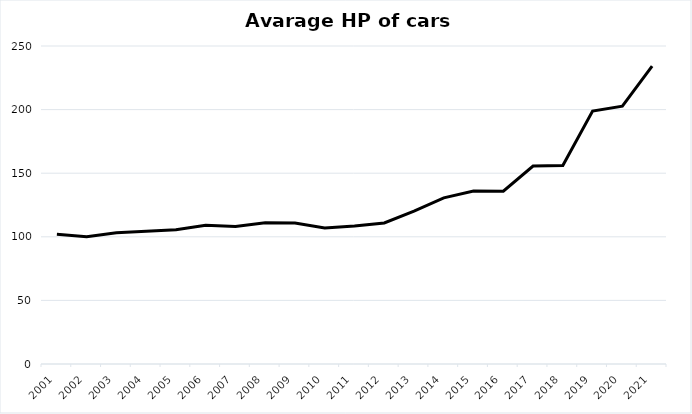
| Category | Series 0 |
|---|---|
| 2001.0 | 101.98 |
| 2002.0 | 100.057 |
| 2003.0 | 103.187 |
| 2004.0 | 104.455 |
| 2005.0 | 105.495 |
| 2006.0 | 109.148 |
| 2007.0 | 108.168 |
| 2008.0 | 111.052 |
| 2009.0 | 110.879 |
| 2010.0 | 106.878 |
| 2011.0 | 108.566 |
| 2012.0 | 110.914 |
| 2013.0 | 120.16 |
| 2014.0 | 130.621 |
| 2015.0 | 135.972 |
| 2016.0 | 135.851 |
| 2017.0 | 155.581 |
| 2018.0 | 156.129 |
| 2019.0 | 198.847 |
| 2020.0 | 202.724 |
| 2021.0 | 234.2 |